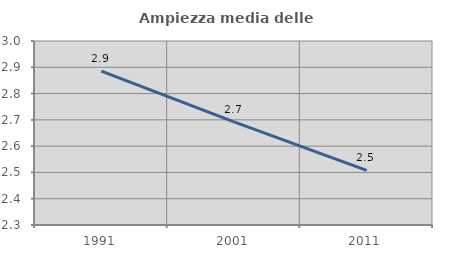
| Category | Ampiezza media delle famiglie |
|---|---|
| 1991.0 | 2.886 |
| 2001.0 | 2.692 |
| 2011.0 | 2.508 |